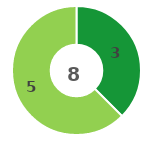
| Category | Series 0 |
|---|---|
| 0 | 3 |
| 1 | 5 |
| 2 | 0 |
| 3 | 0 |
| 4 | 0 |